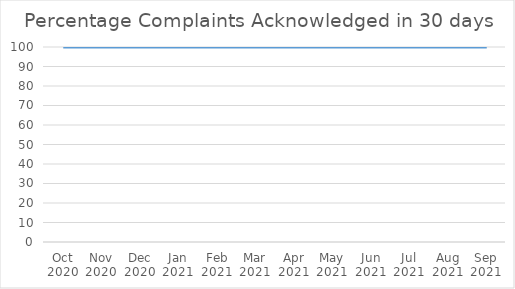
| Category | Percentage |
|---|---|
| Oct 2020 | 100 |
| Nov 2020 | 100 |
| Dec 2020 | 100 |
| Jan 2021 | 100 |
| Feb 2021 | 100 |
| Mar 2021 | 100 |
| Apr 2021 | 100 |
| May 2021 | 100 |
| Jun 2021 | 100 |
| Jul 2021 | 100 |
| Aug 2021 | 100 |
| Sep 2021 | 100 |